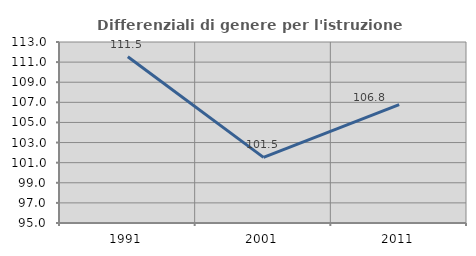
| Category | Differenziali di genere per l'istruzione superiore |
|---|---|
| 1991.0 | 111.538 |
| 2001.0 | 101.528 |
| 2011.0 | 106.777 |